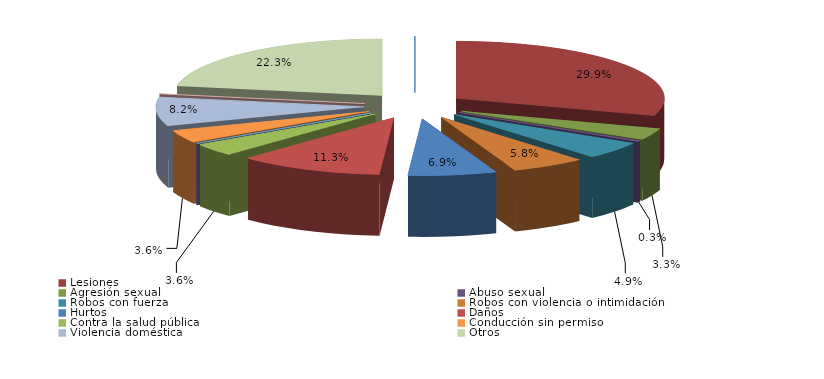
| Category | Series 0 |
|---|---|
| Homicidio/Asesinato dolosos | 0 |
| Lesiones | 109 |
| Agresión sexual | 12 |
| Abuso sexual | 1 |
| Robos con fuerza | 18 |
| Robos con violencia o intimidación | 21 |
| Hurtos | 25 |
| Daños | 41 |
| Contra la salud pública | 13 |
| Conduccción etílica/drogas | 0 |
| Conducción temeraria | 0 |
| Conducción sin permiso | 13 |
| Violencia doméstica | 30 |
| Violencia de género | 0 |
| Otros | 81 |
| Atentados y delitos de resistencia y desobediencia grave | 0 |
| Otros delitos contra el orden público | 0 |